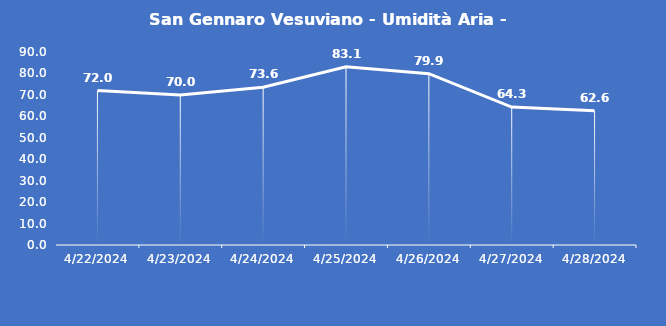
| Category | San Gennaro Vesuviano - Umidità Aria - Grezzo (%) |
|---|---|
| 4/22/24 | 72 |
| 4/23/24 | 70 |
| 4/24/24 | 73.6 |
| 4/25/24 | 83.1 |
| 4/26/24 | 79.9 |
| 4/27/24 | 64.3 |
| 4/28/24 | 62.6 |